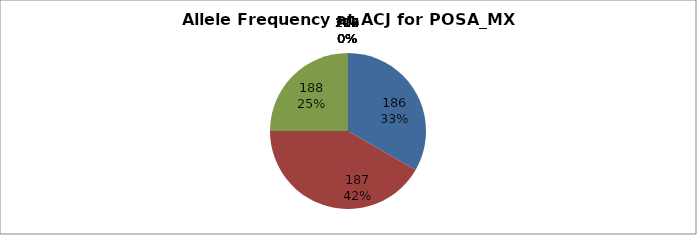
| Category | Series 0 |
|---|---|
| 186.0 | 0.333 |
| 187.0 | 0.417 |
| 188.0 | 0.25 |
| 190.0 | 0 |
| 202.0 | 0 |
| 204.0 | 0 |
| 206.0 | 0 |
| 207.0 | 0 |
| 208.0 | 0 |
| 209.0 | 0 |
| 210.0 | 0 |
| 212.0 | 0 |
| 214.0 | 0 |
| 227.0 | 0 |